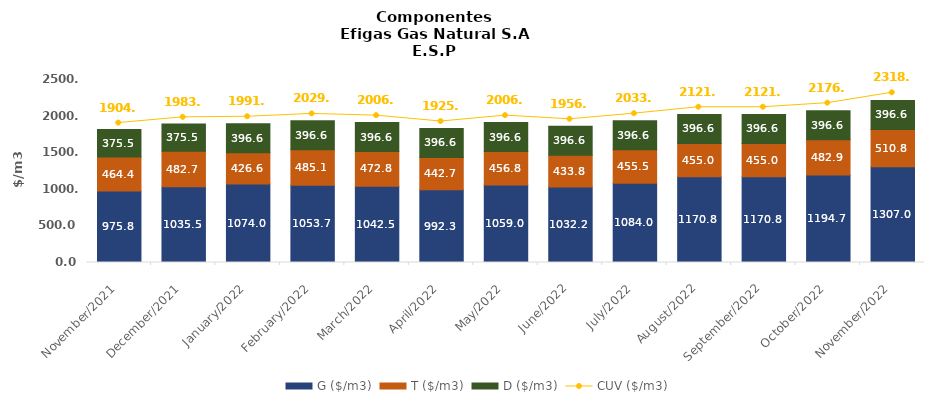
| Category | G ($/m3) | T ($/m3) | D ($/m3) |
|---|---|---|---|
| 2021-11-01 | 975.82 | 464.35 | 375.5 |
| 2021-12-01 | 1035.51 | 482.73 | 375.5 |
| 2022-01-01 | 1074.01 | 426.57 | 396.6 |
| 2022-02-01 | 1053.67 | 485.05 | 396.6 |
| 2022-03-01 | 1042.54 | 472.76 | 396.6 |
| 2022-04-01 | 992.34 | 442.65 | 396.6 |
| 2022-05-01 | 1058.95 | 456.78 | 396.6 |
| 2022-06-01 | 1032.15 | 433.82 | 396.6 |
| 2022-07-01 | 1084.04 | 455.47 | 396.6 |
| 2022-08-01 | 1170.84 | 455.02 | 396.6 |
| 2022-09-01 | 1170.84 | 455.02 | 396.6 |
| 2022-10-01 | 1194.65 | 482.93 | 396.6 |
| 2022-11-01 | 1306.98 | 510.84 | 396.6 |